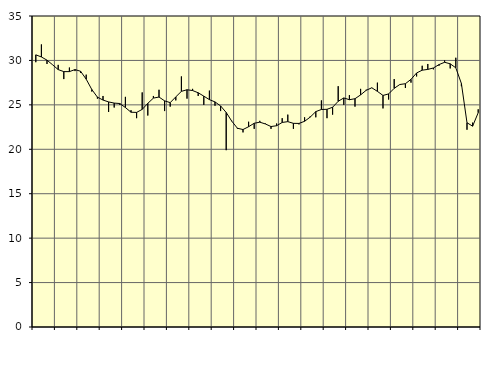
| Category | Piggar | Series 1 |
|---|---|---|
| nan | 29.8 | 30.63 |
| 1.0 | 31.8 | 30.39 |
| 1.0 | 29.6 | 30.03 |
| 1.0 | 29.5 | 29.51 |
| nan | 29.5 | 28.97 |
| 2.0 | 27.9 | 28.74 |
| 2.0 | 29.2 | 28.74 |
| 2.0 | 28.8 | 28.97 |
| nan | 28.6 | 28.78 |
| 3.0 | 28.4 | 27.89 |
| 3.0 | 26.5 | 26.73 |
| 3.0 | 25.7 | 25.87 |
| nan | 26 | 25.54 |
| 4.0 | 24.2 | 25.33 |
| 4.0 | 24.7 | 25.2 |
| 4.0 | 25 | 25.15 |
| nan | 25.9 | 24.7 |
| 5.0 | 24.4 | 24.17 |
| 5.0 | 23.5 | 24.15 |
| 5.0 | 26.4 | 24.49 |
| nan | 23.8 | 25.17 |
| 6.0 | 26 | 25.76 |
| 6.0 | 26.7 | 25.88 |
| 6.0 | 24.3 | 25.45 |
| nan | 24.8 | 25.25 |
| 7.0 | 25.5 | 25.9 |
| 7.0 | 28.2 | 26.52 |
| 7.0 | 25.7 | 26.7 |
| nan | 26.8 | 26.61 |
| 8.0 | 26 | 26.36 |
| 8.0 | 25 | 25.98 |
| 8.0 | 26.6 | 25.59 |
| nan | 24.9 | 25.33 |
| 9.0 | 24.3 | 24.88 |
| 9.0 | 19.9 | 24.14 |
| 9.0 | 23.2 | 23.16 |
| nan | 22.3 | 22.37 |
| 10.0 | 21.9 | 22.22 |
| 10.0 | 23.1 | 22.54 |
| 10.0 | 22.3 | 22.93 |
| nan | 23.2 | 23.05 |
| 11.0 | 22.9 | 22.85 |
| 11.0 | 22.3 | 22.56 |
| 11.0 | 22.9 | 22.65 |
| nan | 23.5 | 23.02 |
| 12.0 | 23.9 | 23.11 |
| 12.0 | 22.3 | 22.92 |
| 12.0 | 22.8 | 22.91 |
| nan | 23.6 | 23.15 |
| 13.0 | 23.7 | 23.62 |
| 13.0 | 23.6 | 24.24 |
| 13.0 | 25.5 | 24.48 |
| nan | 23.5 | 24.5 |
| 14.0 | 23.9 | 24.73 |
| 14.0 | 27.1 | 25.4 |
| 14.0 | 25 | 25.78 |
| nan | 26.1 | 25.58 |
| 15.0 | 24.8 | 25.69 |
| 15.0 | 26.8 | 26.12 |
| 15.0 | 26.7 | 26.64 |
| nan | 26.9 | 26.92 |
| 16.0 | 27.5 | 26.52 |
| 16.0 | 24.6 | 26.06 |
| 16.0 | 25.6 | 26.23 |
| nan | 27.9 | 26.86 |
| 17.0 | 27.3 | 27.29 |
| 17.0 | 26.9 | 27.38 |
| 17.0 | 27.5 | 27.87 |
| nan | 28.2 | 28.59 |
| 18.0 | 29.4 | 28.9 |
| 18.0 | 29.6 | 28.99 |
| 18.0 | 29 | 29.15 |
| nan | 29.4 | 29.53 |
| 19.0 | 30 | 29.79 |
| 19.0 | 29.1 | 29.62 |
| 19.0 | 30.3 | 29.17 |
| nan | 27.1 | 27.4 |
| 20.0 | 22.2 | 22.99 |
| 20.0 | 23 | 22.6 |
| 20.0 | 24.5 | 24.11 |